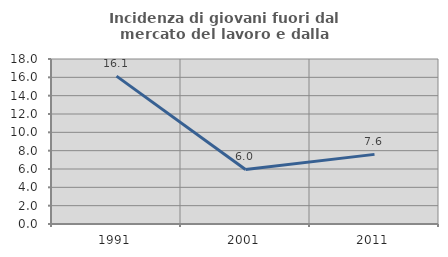
| Category | Incidenza di giovani fuori dal mercato del lavoro e dalla formazione  |
|---|---|
| 1991.0 | 16.129 |
| 2001.0 | 5.952 |
| 2011.0 | 7.595 |